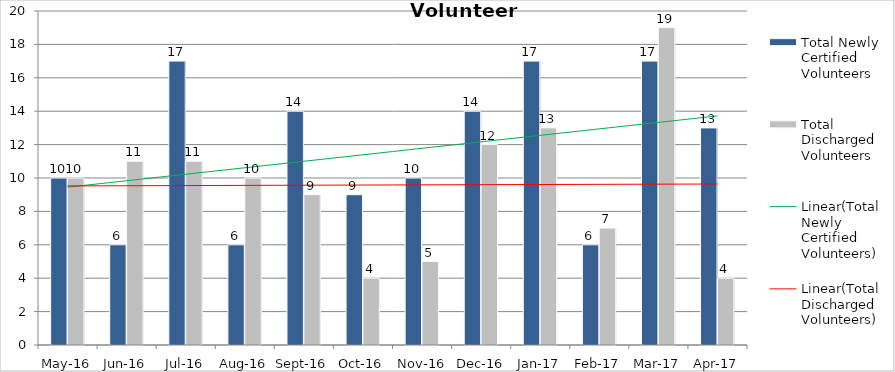
| Category | Total Newly Certified Volunteers | Total Discharged Volunteers |
|---|---|---|
| May-16 | 10 | 10 |
| Jun-16 | 6 | 11 |
| Jul-16 | 17 | 11 |
| Aug-16 | 6 | 10 |
| Sep-16 | 14 | 9 |
| Oct-16 | 9 | 4 |
| Nov-16 | 10 | 5 |
| Dec-16 | 14 | 12 |
| Jan-17 | 17 | 13 |
| Feb-17 | 6 | 7 |
| Mar-17 | 17 | 19 |
| Apr-17 | 13 | 4 |